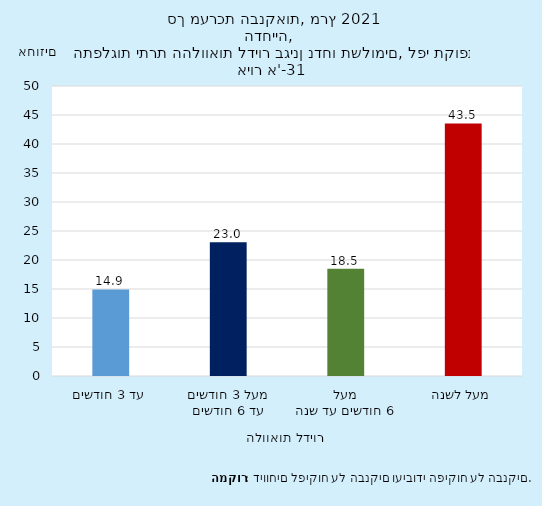
| Category | Series 0 |
|---|---|
| 0 | 14.914 |
| 1 | 23.048 |
| 2 | 18.498 |
| 3 | 43.54 |